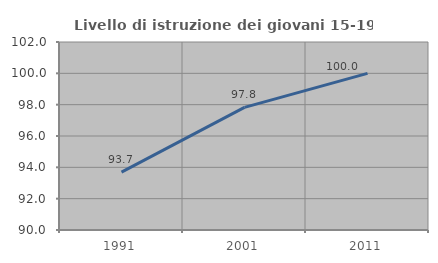
| Category | Livello di istruzione dei giovani 15-19 anni |
|---|---|
| 1991.0 | 93.694 |
| 2001.0 | 97.826 |
| 2011.0 | 100 |